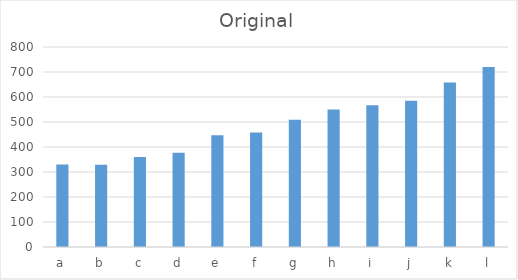
| Category | 2011 |
|---|---|
| a | 330.33 |
| b | 329.35 |
| c | 359.85 |
| d | 376.94 |
| e | 446.86 |
| f | 457.7 |
| g | 509.38 |
| h | 549.9 |
| i | 566.84 |
| j | 585.2 |
| k | 658.24 |
| l | 720.2 |